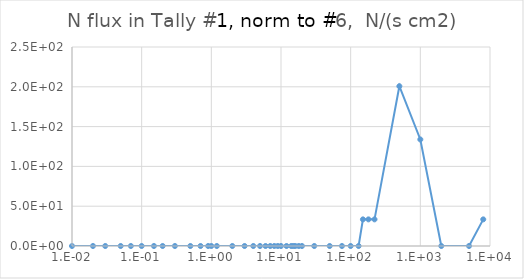
| Category | Series 0 |
|---|---|
| 1e-09 | 0 |
| 1e-08 | 0 |
| 2.5e-08 | 0 |
| 1e-07 | 0 |
| 2e-07 | 0 |
| 5e-07 | 0 |
| 1e-06 | 0 |
| 2e-06 | 0 |
| 5e-06 | 0 |
| 1e-05 | 0 |
| 2e-05 | 0 |
| 5e-05 | 0 |
| 0.0001 | 0 |
| 0.0002 | 0 |
| 0.0005 | 0 |
| 0.001 | 0 |
| 0.002 | 0 |
| 0.005 | 0 |
| 0.01 | 0 |
| 0.02 | 0 |
| 0.03 | 0 |
| 0.05 | 0 |
| 0.07 | 0 |
| 0.1 | 0 |
| 0.15 | 0 |
| 0.2 | 0 |
| 0.3 | 0 |
| 0.5 | 0 |
| 0.7 | 0 |
| 0.9 | 0 |
| 1.0 | 0 |
| 1.2 | 0 |
| 2.0 | 0 |
| 3.0 | 0 |
| 4.0 | 0 |
| 5.0 | 0 |
| 6.0 | 0 |
| 7.0 | 0 |
| 8.0 | 0 |
| 9.0 | 0 |
| 10.0 | 0 |
| 12.0 | 0 |
| 14.0 | 0 |
| 15.0 | 0 |
| 16.0 | 0 |
| 18.0 | 0 |
| 20.0 | 0 |
| 30.0 | 0 |
| 50.0 | 0 |
| 75.0 | 0 |
| 100.0 | 0 |
| 130.0 | 0 |
| 150.0 | 1.673 |
| 180.0 | 1.115 |
| 220.0 | 0.836 |
| 500.0 | 0.717 |
| 1000.0 | 0.268 |
| 2000.0 | 0 |
| 5000.0 | 0 |
| 8000.0 | 0.011 |